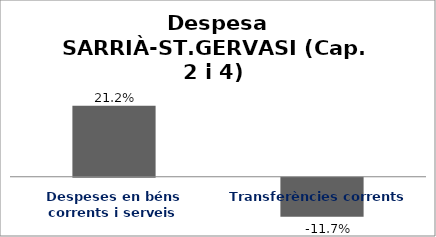
| Category | Series 0 |
|---|---|
| Despeses en béns corrents i serveis | 0.212 |
| Transferències corrents | -0.117 |